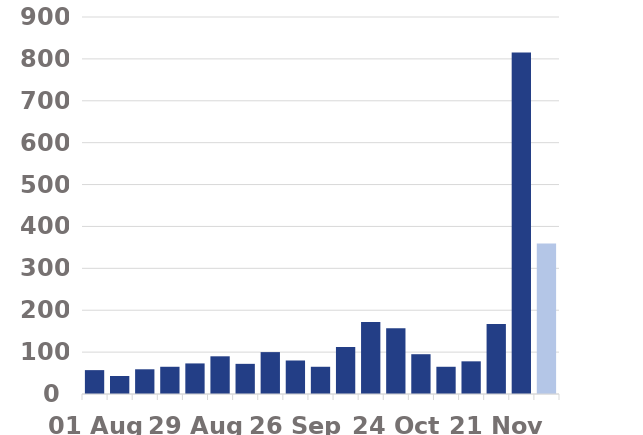
| Category | SGTF cases |
|---|---|
| 01 Aug | 57 |
| 08 Aug | 43 |
| 15 Aug | 59 |
| 22 Aug | 65 |
| 29 Aug | 73 |
| 05 Sep | 90 |
| 12 Sep | 72 |
| 19 Sep | 100 |
| 26 Sep | 80 |
| 03 Oct | 65 |
| 10 Oct | 112 |
| 17 Oct | 172 |
| 24 Oct | 157 |
| 31 Oct | 95 |
| 07 Nov | 65 |
| 14 Nov | 78 |
| 21 Nov | 167 |
| 28 Nov | 815 |
| 05 Dec | 359 |